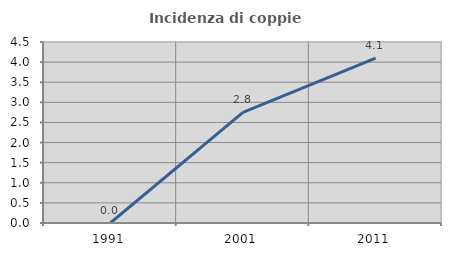
| Category | Incidenza di coppie miste |
|---|---|
| 1991.0 | 0 |
| 2001.0 | 2.752 |
| 2011.0 | 4.098 |